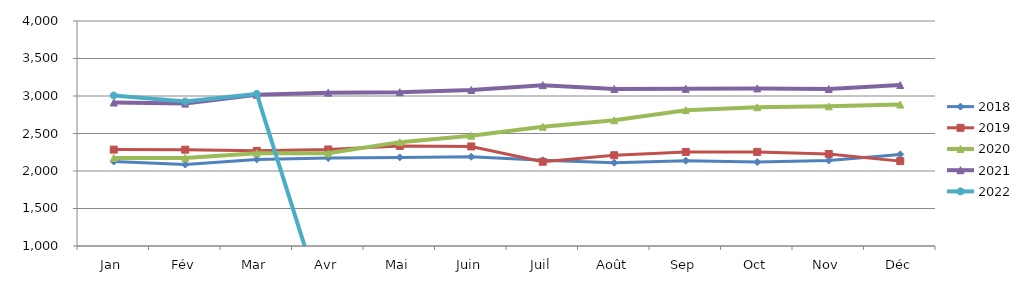
| Category | 2018 | 2019 | 2020 | 2021 | 2022 |
|---|---|---|---|---|---|
| Jan | 2126.43 | 2285.077 | 2174.068 | 2912.819 | 3006.467 |
| Fév | 2086.116 | 2284.041 | 2173.963 | 2898.489 | 2926.234 |
| Mar | 2154.19 | 2268.401 | 2238.064 | 3017.436 | 3028.062 |
| Avr | 2172.692 | 2286.951 | 2235.688 | 3044.815 | 0 |
| Mai | 2181.426 | 2334.869 | 2384.721 | 3050.874 | 0 |
| Juin | 2190.216 | 2327.493 | 2470.094 | 3080.307 | 0 |
| Juil | 2142.84 | 2123.041 | 2589.895 | 3144.694 | 0 |
| Août | 2110.076 | 2210.394 | 2677.173 | 3094.04 | 0 |
| Sep | 2137.072 | 2253.916 | 2811.251 | 3095.309 | 0 |
| Oct | 2119.873 | 2254.192 | 2850.494 | 3100.983 | 0 |
| Nov | 2140.872 | 2226.879 | 2862.02 | 3093.674 | 0 |
| Déc | 2221.568 | 2131.58 | 2885.572 | 3146.391 | 0 |